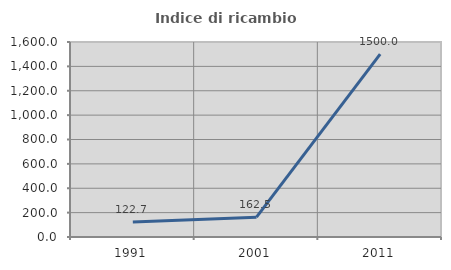
| Category | Indice di ricambio occupazionale  |
|---|---|
| 1991.0 | 122.727 |
| 2001.0 | 162.5 |
| 2011.0 | 1500 |